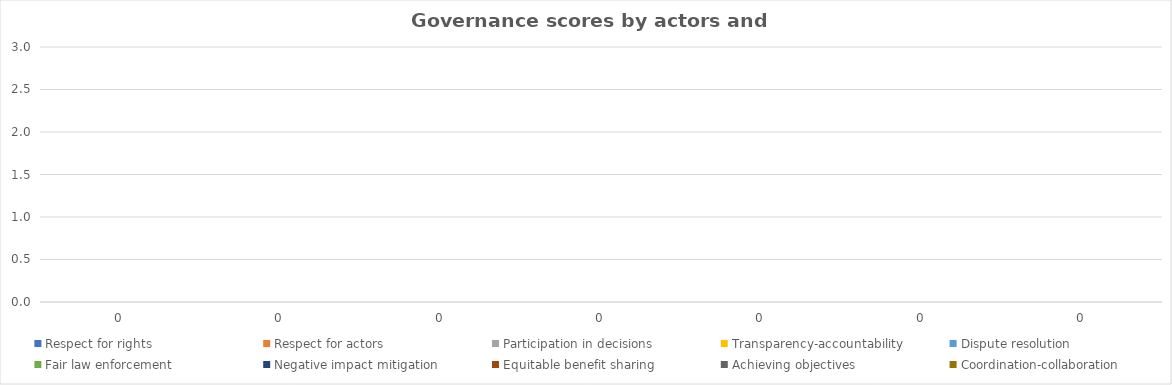
| Category | Respect for rights | Respect for actors | Participation in decisions | Transparency-accountability | Dispute resolution | Fair law enforcement | Negative impact mitigation | Equitable benefit sharing | Achieving objectives | Coordination-collaboration |
|---|---|---|---|---|---|---|---|---|---|---|
| 0.0 | 0 | 0 | 0 | 0 | 0 | 0 | 0 | 0 | 0 | 0 |
| 0.0 | 0 | 0 | 0 | 0 | 0 | 0 | 0 | 0 | 0 | 0 |
| 0.0 | 0 | 0 | 0 | 0 | 0 | 0 | 0 | 0 | 0 | 0 |
| 0.0 | 0 | 0 | 0 | 0 | 0 | 0 | 0 | 0 | 0 | 0 |
| 0.0 | 0 | 0 | 0 | 0 | 0 | 0 | 0 | 0 | 0 | 0 |
| 0.0 | 0 | 0 | 0 | 0 | 0 | 0 | 0 | 0 | 0 | 0 |
| 0.0 | 0 | 0 | 0 | 0 | 0 | 0 | 0 | 0 | 0 | 0 |